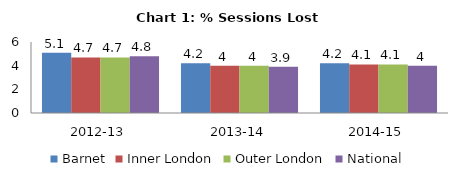
| Category | Barnet | Inner London | Outer London | National |
|---|---|---|---|---|
| 2012-13 | 5.1 | 4.7 | 4.7 | 4.8 |
| 2013-14 | 4.2 | 4 | 4 | 3.9 |
| 2014-15 | 4.2 | 4.1 | 4.1 | 4 |